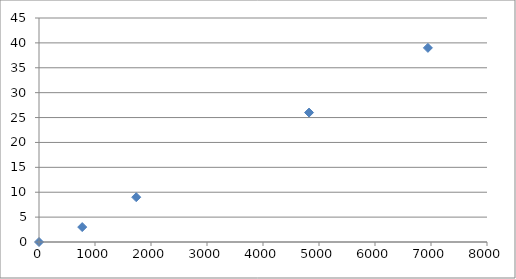
| Category | Series 0 |
|---|---|
| 0.0 | 0 |
| 771.604938271605 | 3 |
| 1736.1111111111109 | 9 |
| 4822.530864197531 | 26 |
| 6944.444444444443 | 39 |